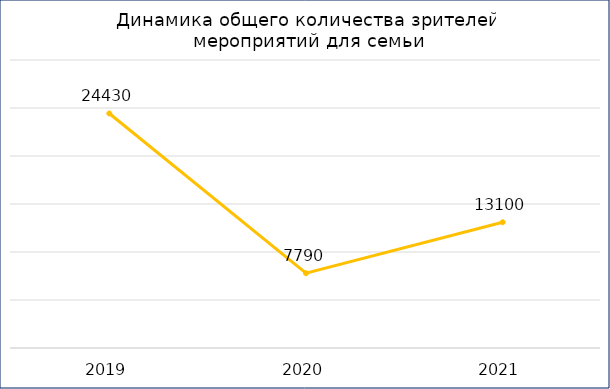
| Category | ИТОГО |
|---|---|
| 2019.0 | 24430 |
| 2020.0 | 7790 |
| 2021.0 | 13100 |